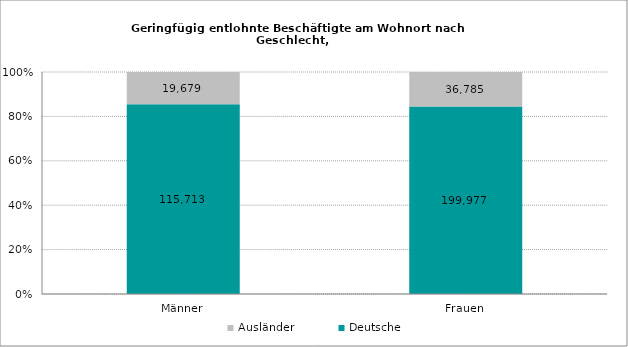
| Category | Deutsche | Ausländer |
|---|---|---|
| Männer | 115713 | 19679 |
| Frauen | 199977 | 36785 |